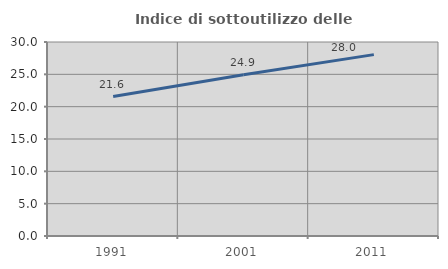
| Category | Indice di sottoutilizzo delle abitazioni  |
|---|---|
| 1991.0 | 21.566 |
| 2001.0 | 24.925 |
| 2011.0 | 28.048 |